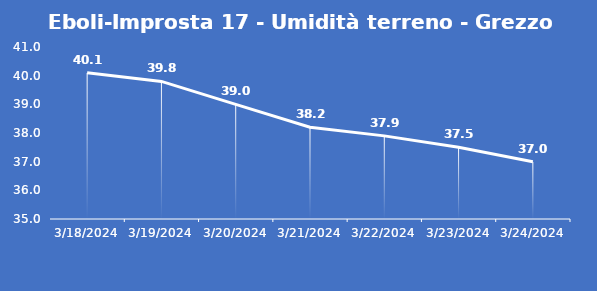
| Category | Eboli-Improsta 17 - Umidità terreno - Grezzo (%VWC) |
|---|---|
| 3/18/24 | 40.1 |
| 3/19/24 | 39.8 |
| 3/20/24 | 39 |
| 3/21/24 | 38.2 |
| 3/22/24 | 37.9 |
| 3/23/24 | 37.5 |
| 3/24/24 | 37 |